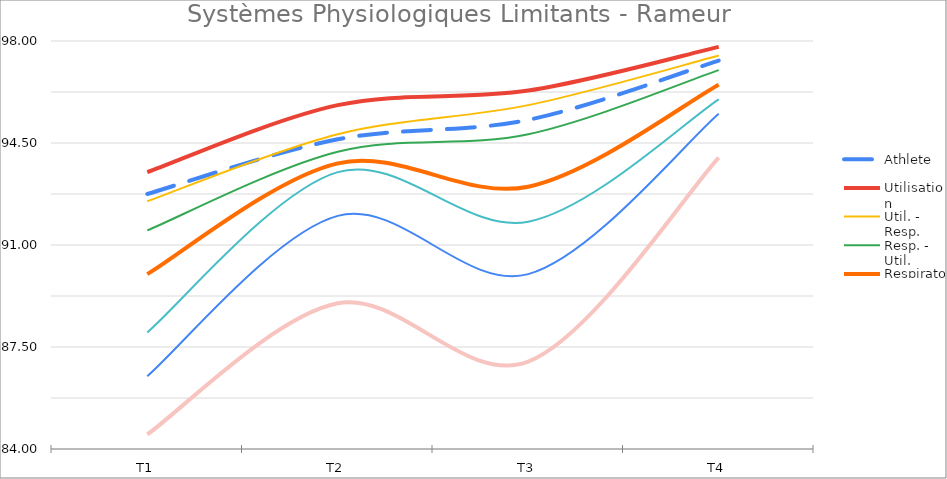
| Category | Athlete | Utilisation | Util. - Resp. | Resp. - Util. | Respiratoire | Resp. - Card. | Card. - Resp. | Cardiaque |
|---|---|---|---|---|---|---|---|---|
| T1 | 92.75 | 93.5 | 92.5 | 91.5 | 90 | 88 | 86.5 | 84.5 |
| T2 | 94.626 | 95.8 | 94.8 | 94.2 | 93.8 | 93.5 | 92 | 89 |
| T3 | 95.296 | 96.3 | 95.8 | 94.8 | 93 | 91.8 | 90 | 87 |
| T4 | 97.329 | 97.8 | 97.5 | 97 | 96.5 | 96 | 95.5 | 94 |